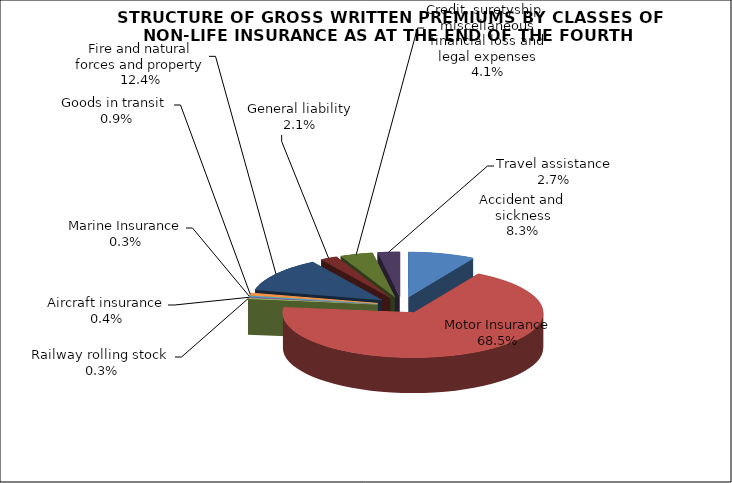
| Category | Accident and sickness |
|---|---|
| Accident and sickness | 0.083 |
| Motor Insurance | 0.685 |
| Railway rolling stock  | 0.003 |
| Aircraft insurance | 0.004 |
| Marine Insurance | 0.003 |
| Goods in transit  | 0.009 |
| Fire and natural forces and property | 0.124 |
| General liability | 0.021 |
| Credit, suretyship, miscellaneous financial loss and legal expenses | 0.041 |
| Travel assistance | 0.027 |